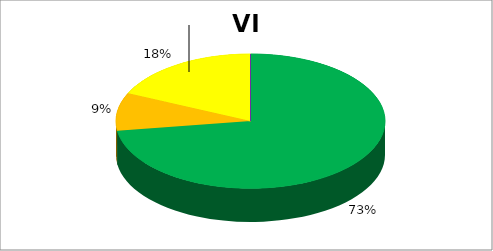
| Category | VI Образовање |
|---|---|
| 0 | 0.727 |
| 1 | 0.091 |
| 2 | 0.182 |
| 3 | 0 |
| 4 | 0 |